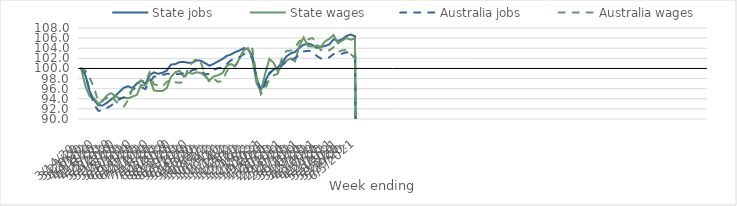
| Category | State jobs | State wages | Australia jobs | Australia wages |
|---|---|---|---|---|
| 14/03/2020 | 100 | 100 | 100 | 100 |
| 21/03/2020 | 98.663 | 96.49 | 98.972 | 99.605 |
| 28/03/2020 | 95.437 | 94.466 | 95.467 | 98.106 |
| 04/04/2020 | 93.778 | 94.155 | 92.921 | 96.238 |
| 11/04/2020 | 92.735 | 93.018 | 91.648 | 93.491 |
| 18/04/2020 | 92.663 | 93.507 | 91.631 | 93.694 |
| 25/04/2020 | 93.194 | 94.659 | 92.161 | 94.113 |
| 02/05/2020 | 93.841 | 95.158 | 92.658 | 94.66 |
| 09/05/2020 | 94.558 | 94.496 | 93.343 | 93.583 |
| 16/05/2020 | 95.419 | 94.107 | 93.936 | 92.817 |
| 23/05/2020 | 96.194 | 94.223 | 94.294 | 92.471 |
| 30/05/2020 | 96.471 | 94.122 | 94.802 | 93.799 |
| 06/06/2020 | 96.086 | 94.441 | 95.786 | 95.975 |
| 13/06/2020 | 97.014 | 94.734 | 96.286 | 96.648 |
| 20/06/2020 | 97.611 | 96.722 | 96.302 | 97.605 |
| 27/06/2020 | 96.917 | 96.591 | 95.914 | 97.364 |
| 04/07/2020 | 98.643 | 97.987 | 97.234 | 99.209 |
| 11/07/2020 | 99.222 | 95.652 | 98.377 | 96.842 |
| 18/07/2020 | 98.944 | 95.525 | 98.483 | 96.672 |
| 25/07/2020 | 99.143 | 95.514 | 98.707 | 96.464 |
| 01/08/2020 | 99.571 | 96.107 | 98.939 | 97.319 |
| 08/08/2020 | 100.779 | 98.362 | 98.937 | 97.774 |
| 15/08/2020 | 100.852 | 99.219 | 98.822 | 97.284 |
| 22/08/2020 | 101.248 | 99.557 | 98.911 | 97.15 |
| 29/08/2020 | 101.28 | 98.376 | 99.048 | 97.377 |
| 05/09/2020 | 101.135 | 99.169 | 99.236 | 100.159 |
| 12/09/2020 | 101.135 | 98.964 | 99.656 | 101.158 |
| 19/09/2020 | 101.608 | 99.232 | 99.825 | 101.963 |
| 26/09/2020 | 101.528 | 99.097 | 99.625 | 101.122 |
| 03/10/2020 | 101.031 | 98.476 | 98.824 | 98.703 |
| 10/10/2020 | 100.537 | 97.616 | 98.93 | 97.286 |
| 17/10/2020 | 100.929 | 98.422 | 99.758 | 97.926 |
| 24/10/2020 | 101.397 | 98.651 | 100.051 | 97.346 |
| 31/10/2020 | 101.852 | 99.075 | 100.234 | 97.513 |
| 07/11/2020 | 102.476 | 100.505 | 100.843 | 99.39 |
| 14/11/2020 | 102.754 | 100.87 | 101.614 | 100.362 |
| 21/11/2020 | 103.227 | 100.484 | 101.941 | 100.423 |
| 28/11/2020 | 103.551 | 101.906 | 102.262 | 101.777 |
| 05/12/2020 | 104.029 | 103.674 | 102.828 | 103.567 |
| 12/12/2020 | 103.776 | 104.001 | 102.902 | 104.028 |
| 19/12/2020 | 102.612 | 101.91 | 102.101 | 103.902 |
| 26/12/2020 | 97.964 | 97.055 | 98.307 | 98.441 |
| 02/01/2021 | 95.824 | 95.516 | 95.41 | 94.903 |
| 09/01/2021 | 97.458 | 98.895 | 96.79 | 95.912 |
| 16/01/2021 | 99.108 | 101.892 | 98.893 | 97.958 |
| 23/01/2021 | 99.79 | 101.101 | 99.862 | 98.634 |
| 30/01/2021 | 100.26 | 99.333 | 100.346 | 98.978 |
| 06/02/2021 | 101.192 | 100.683 | 100.698 | 102.329 |
| 13/02/2021 | 102.393 | 101.532 | 101.406 | 103.465 |
| 20/02/2021 | 102.979 | 101.972 | 101.644 | 103.55 |
| 27/02/2021 | 103.28 | 101.411 | 102.078 | 104.122 |
| 06/03/2021 | 104.085 | 104.459 | 102.697 | 105.405 |
| 13/03/2021 | 104.675 | 106.13 | 103.369 | 105.802 |
| 20/03/2021 | 104.93 | 104.416 | 103.483 | 105.731 |
| 27/03/2021 | 104.678 | 104.339 | 103.4 | 106.023 |
| 03/04/2021 | 104.068 | 104.545 | 102.51 | 105.184 |
| 10/04/2021 | 104.259 | 104.24 | 101.979 | 103.615 |
| 17/04/2021 | 104.436 | 105.361 | 101.926 | 103.956 |
| 24/04/2021 | 104.75 | 105.849 | 102.186 | 103.563 |
| 01/05/2021 | 105.767 | 106.618 | 102.848 | 104.217 |
| 08/05/2021 | 105.465 | 104.975 | 102.834 | 103.251 |
| 15/05/2021 | 105.76 | 105.508 | 102.922 | 103.573 |
| 22/05/2021 | 106.411 | 106.014 | 103.224 | 103.677 |
| 29/05/2021 | 106.717 | 105.683 | 102.941 | 102.856 |
| 05/06/2021 | 106.36 | 105.925 | 102.252 | 102.059 |